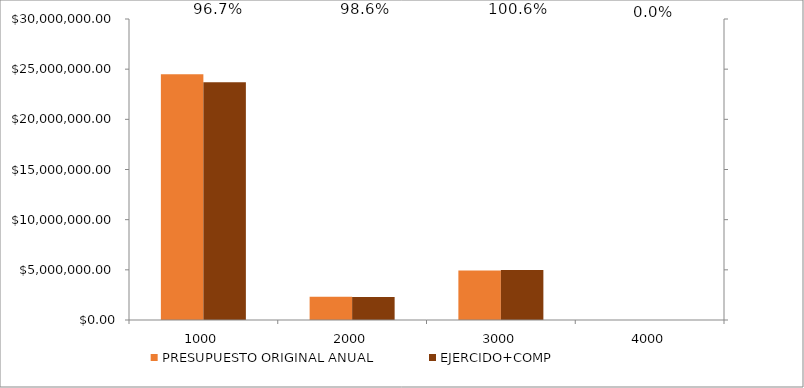
| Category | PRESUPUESTO ORIGINAL ANUAL | EJERCIDO+COMP |
|---|---|---|
| 1000.0 | 24490834 | 23692978.15 |
| 2000.0 | 2324450 | 2292352.32 |
| 3000.0 | 4939979 | 4972076.68 |
| 4000.0 | 0 | 0 |